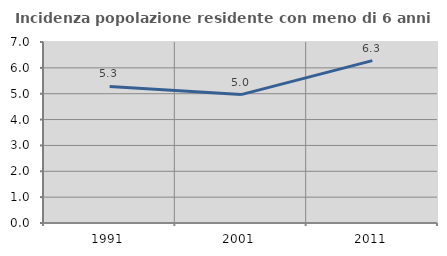
| Category | Incidenza popolazione residente con meno di 6 anni |
|---|---|
| 1991.0 | 5.28 |
| 2001.0 | 4.966 |
| 2011.0 | 6.281 |